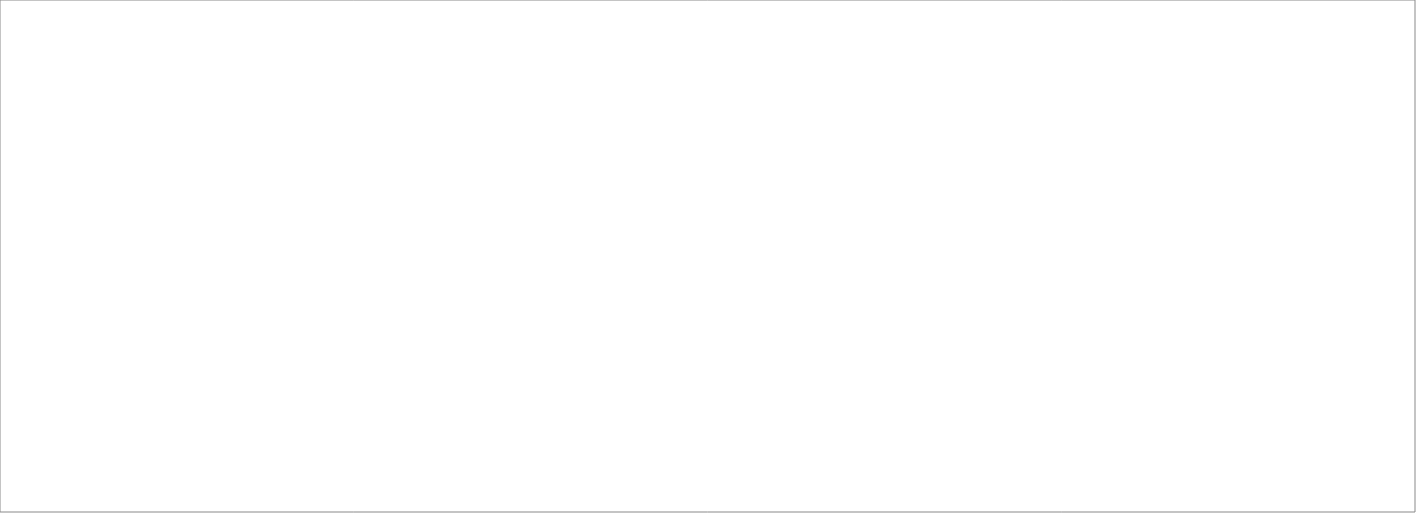
| Category | Total |
|---|---|
| Assessio Sverige AB | 100 |
| Michael Catenacci AB | 70 |
| Talogy Sweden AB | 70 |
| OnePartner Group AB | 70 |
| Randstad AB | 70 |